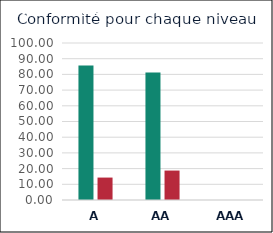
| Category | Series 0 | Series 1 |
|---|---|---|
| A | 85.714 | 14.286 |
| AA | 81.25 | 18.75 |
| AAA | 0 | 0 |